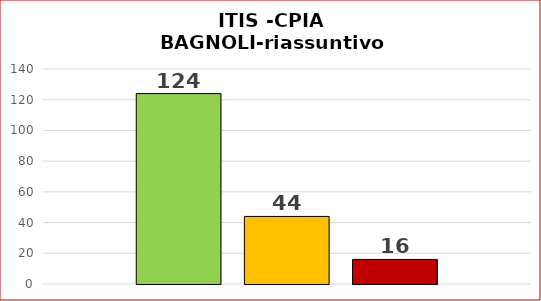
| Category | SUPERATI | PARZIAL.NTE SUPERATI | NON SUPERATI |
|---|---|---|---|
| 0 | 124 | 44 | 16 |